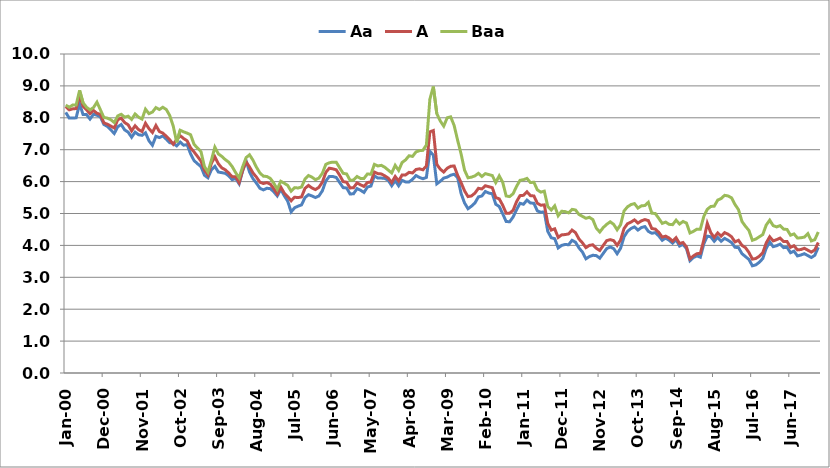
| Category | Aa | A | Baa |
|---|---|---|---|
| 2000-01-01 | 8.17 | 8.35 | 8.4 |
| 2000-02-01 | 7.99 | 8.25 | 8.33 |
| 2000-03-01 | 7.99 | 8.28 | 8.4 |
| 2000-04-01 | 8 | 8.29 | 8.4 |
| 2000-05-01 | 8.44 | 8.7 | 8.86 |
| 2000-06-01 | 8.1 | 8.36 | 8.47 |
| 2000-07-01 | 8.1 | 8.25 | 8.33 |
| 2000-08-01 | 7.96 | 8.13 | 8.25 |
| 2000-09-01 | 8.11 | 8.23 | 8.32 |
| 2000-10-01 | 8.08 | 8.14 | 8.49 |
| 2000-11-01 | 8.03 | 8.11 | 8.25 |
| 2000-12-01 | 7.79 | 7.84 | 8.01 |
| 2001-01-01 | 7.73 | 7.8 | 7.99 |
| 2001-02-01 | 7.62 | 7.74 | 7.94 |
| 2001-03-01 | 7.51 | 7.68 | 7.85 |
| 2001-04-01 | 7.72 | 7.94 | 8.06 |
| 2001-05-01 | 7.79 | 7.99 | 8.11 |
| 2001-06-01 | 7.62 | 7.85 | 8.02 |
| 2001-07-01 | 7.55 | 7.78 | 8.05 |
| 2001-08-01 | 7.39 | 7.59 | 7.95 |
| 2001-09-01 | 7.55 | 7.75 | 8.12 |
| 2001-10-01 | 7.47 | 7.63 | 8.02 |
| 2001-11-01 | 7.45 | 7.57 | 7.96 |
| 2001-12-01 | 7.53 | 7.83 | 8.27 |
| 2002-01-01 | 7.28 | 7.66 | 8.13 |
| 2002-02-01 | 7.14 | 7.54 | 8.18 |
| 2002-03-01 | 7.42 | 7.76 | 8.32 |
| 2002-04-01 | 7.38 | 7.57 | 8.26 |
| 2002-05-01 | 7.43 | 7.52 | 8.33 |
| 2002-06-01 | 7.33 | 7.42 | 8.26 |
| 2002-07-01 | 7.22 | 7.31 | 8.07 |
| 2002-08-01 | 7.2 | 7.17 | 7.74 |
| 2002-09-01 | 7.12 | 7.32 | 7.23 |
| 2002-10-01 | 7.24 | 7.44 | 7.61 |
| 2002-11-01 | 7.14 | 7.35 | 7.56 |
| 2002-12-01 | 7.16 | 7.28 | 7.52 |
| 2003-01-01 | 6.87 | 7.06 | 7.47 |
| 2003-02-01 | 6.66 | 6.93 | 7.17 |
| 2003-03-01 | 6.56 | 6.79 | 7.05 |
| 2003-04-01 | 6.47 | 6.64 | 6.94 |
| 2003-05-01 | 6.2 | 6.36 | 6.47 |
| 2003-06-01 | 6.12 | 6.21 | 6.3 |
| 2003-07-01 | 6.37 | 6.57 | 6.67 |
| 2003-08-01 | 6.48 | 6.78 | 7.08 |
| 2003-09-01 | 6.3 | 6.56 | 6.87 |
| 2003-10-01 | 6.28 | 6.43 | 6.79 |
| 2003-11-01 | 6.26 | 6.37 | 6.69 |
| 2003-12-01 | 6.18 | 6.27 | 6.61 |
| 2004-01-01 | 6.06 | 6.15 | 6.47 |
| 2004-02-01 | 6.1 | 6.15 | 6.28 |
| 2004-03-01 | 5.93 | 5.97 | 6.12 |
| 2004-04-01 | 6.33 | 6.35 | 6.46 |
| 2004-05-01 | 6.66 | 6.62 | 6.75 |
| 2004-06-01 | 6.3 | 6.46 | 6.84 |
| 2004-07-01 | 6.09 | 6.27 | 6.67 |
| 2004-08-01 | 5.95 | 6.14 | 6.45 |
| 2004-09-01 | 5.79 | 5.98 | 6.27 |
| 2004-10-01 | 5.74 | 5.94 | 6.17 |
| 2004-11-01 | 5.79 | 5.97 | 6.16 |
| 2004-12-01 | 5.78 | 5.92 | 6.1 |
| 2005-01-01 | 5.68 | 5.78 | 5.95 |
| 2005-02-01 | 5.55 | 5.61 | 5.76 |
| 2005-03-01 | 5.76 | 5.83 | 6.01 |
| 2005-04-01 | 5.56 | 5.64 | 5.95 |
| 2005-05-01 | 5.39 | 5.53 | 5.88 |
| 2005-06-01 | 5.05 | 5.4 | 5.7 |
| 2005-07-01 | 5.18 | 5.51 | 5.81 |
| 2005-08-01 | 5.23 | 5.5 | 5.8 |
| 2005-09-01 | 5.27 | 5.52 | 5.83 |
| 2005-10-01 | 5.5 | 5.79 | 6.08 |
| 2005-11-01 | 5.59 | 5.88 | 6.19 |
| 2005-12-01 | 5.55 | 5.8 | 6.14 |
| 2006-01-01 | 5.5 | 5.75 | 6.06 |
| 2006-02-01 | 5.55 | 5.82 | 6.11 |
| 2006-03-01 | 5.71 | 5.98 | 6.26 |
| 2006-04-01 | 6.02 | 6.29 | 6.54 |
| 2006-05-01 | 6.16 | 6.42 | 6.59 |
| 2006-06-01 | 6.16 | 6.4 | 6.61 |
| 2006-07-01 | 6.13 | 6.37 | 6.61 |
| 2006-08-01 | 5.97 | 6.2 | 6.43 |
| 2006-09-01 | 5.81 | 6 | 6.26 |
| 2006-10-01 | 5.8 | 5.98 | 6.24 |
| 2006-11-01 | 5.61 | 5.8 | 6.04 |
| 2006-12-01 | 5.62 | 5.81 | 6.05 |
| 2007-01-01 | 5.78 | 5.96 | 6.16 |
| 2007-02-01 | 5.73 | 5.9 | 6.1 |
| 2007-03-01 | 5.66 | 5.85 | 6.1 |
| 2007-04-01 | 5.83 | 5.97 | 6.24 |
| 2007-05-01 | 5.86 | 5.99 | 6.23 |
| 2007-06-01 | 6.18 | 6.3 | 6.54 |
| 2007-07-01 | 6.11 | 6.25 | 6.49 |
| 2007-08-01 | 6.11 | 6.24 | 6.51 |
| 2007-09-01 | 6.1 | 6.18 | 6.45 |
| 2007-10-01 | 6.04 | 6.11 | 6.36 |
| 2007-11-01 | 5.87 | 5.97 | 6.27 |
| 2007-12-01 | 6.03 | 6.16 | 6.51 |
| 2008-01-01 | 5.87 | 6.02 | 6.35 |
| 2008-02-01 | 6.04 | 6.21 | 6.6 |
| 2008-03-01 | 5.99 | 6.21 | 6.68 |
| 2008-04-01 | 5.99 | 6.29 | 6.81 |
| 2008-05-01 | 6.07 | 6.27 | 6.79 |
| 2008-06-01 | 6.19 | 6.38 | 6.93 |
| 2008-07-01 | 6.13 | 6.4 | 6.97 |
| 2008-08-01 | 6.09 | 6.37 | 6.98 |
| 2008-09-01 | 6.13 | 6.49 | 7.15 |
| 2008-10-01 | 6.95 | 7.56 | 8.58 |
| 2008-11-01 | 6.83 | 7.6 | 8.98 |
| 2008-12-01 | 5.93 | 6.54 | 8.13 |
| 2009-01-01 | 6.01 | 6.39 | 7.9 |
| 2009-02-01 | 6.11 | 6.3 | 7.74 |
| 2009-03-01 | 6.14 | 6.42 | 8 |
| 2009-04-01 | 6.2 | 6.48 | 8.03 |
| 2009-05-01 | 6.23 | 6.49 | 7.76 |
| 2009-06-01 | 6.13 | 6.2 | 7.3 |
| 2009-07-01 | 5.63 | 5.97 | 6.87 |
| 2009-08-01 | 5.33 | 5.71 | 6.36 |
| 2009-09-01 | 5.15 | 5.53 | 6.12 |
| 2009-10-01 | 5.23 | 5.55 | 6.14 |
| 2009-11-01 | 5.33 | 5.64 | 6.18 |
| 2009-12-01 | 5.52 | 5.79 | 6.26 |
| 2010-01-01 | 5.55 | 5.77 | 6.16 |
| 2010-02-01 | 5.69 | 5.87 | 6.25 |
| 2010-03-01 | 5.64 | 5.84 | 6.22 |
| 2010-04-01 | 5.62 | 5.81 | 6.19 |
| 2010-05-01 | 5.29 | 5.5 | 5.97 |
| 2010-06-01 | 5.22 | 5.46 | 6.18 |
| 2010-07-01 | 4.99 | 5.26 | 5.98 |
| 2010-08-01 | 4.75 | 5.01 | 5.55 |
| 2010-09-01 | 4.74 | 5.01 | 5.53 |
| 2010-10-01 | 4.89 | 5.1 | 5.62 |
| 2010-11-01 | 5.12 | 5.37 | 5.85 |
| 2010-12-01 | 5.32 | 5.56 | 6.04 |
| 2011-01-01 | 5.29 | 5.57 | 6.06 |
| 2011-02-01 | 5.42 | 5.68 | 6.1 |
| 2011-03-01 | 5.33 | 5.56 | 5.97 |
| 2011-04-01 | 5.32 | 5.55 | 5.98 |
| 2011-05-01 | 5.08 | 5.32 | 5.74 |
| 2011-06-01 | 5.04 | 5.26 | 5.67 |
| 2011-07-01 | 5.05 | 5.27 | 5.7 |
| 2011-08-01 | 4.44 | 4.69 | 5.22 |
| 2011-09-01 | 4.24 | 4.48 | 5.11 |
| 2011-10-01 | 4.21 | 4.52 | 5.24 |
| 2011-11-01 | 3.92 | 4.25 | 4.93 |
| 2011-12-01 | 4 | 4.33 | 5.07 |
| 2012-01-01 | 4.03 | 4.34 | 5.06 |
| 2012-02-01 | 4.02 | 4.36 | 5.02 |
| 2012-03-01 | 4.16 | 4.48 | 5.13 |
| 2012-04-01 | 4.1 | 4.4 | 5.11 |
| 2012-05-01 | 3.92 | 4.2 | 4.97 |
| 2012-06-01 | 3.79 | 4.08 | 4.91 |
| 2012-07-01 | 3.58 | 3.93 | 4.85 |
| 2012-08-01 | 3.65 | 4 | 4.88 |
| 2012-09-01 | 3.69 | 4.02 | 4.81 |
| 2012-10-01 | 3.68 | 3.91 | 4.54 |
| 2012-11-01 | 3.6 | 3.84 | 4.42 |
| 2012-12-01 | 3.75 | 4 | 4.56 |
| 2013-01-01 | 3.9 | 4.15 | 4.66 |
| 2013-02-01 | 3.95 | 4.18 | 4.74 |
| 2013-03-01 | 3.9 | 4.15 | 4.66 |
| 2013-04-01 | 3.74 | 4 | 4.49 |
| 2013-05-01 | 3.91 | 4.17 | 4.65 |
| 2013-06-01 | 4.27 | 4.53 | 5.08 |
| 2013-07-01 | 4.44 | 4.68 | 5.21 |
| 2013-08-01 | 4.53 | 4.73 | 5.28 |
| 2013-09-01 | 4.58 | 4.8 | 5.31 |
| 2013-10-01 | 4.48 | 4.7 | 5.17 |
| 2013-11-01 | 4.56 | 4.77 | 5.24 |
| 2013-12-01 | 4.59 | 4.81 | 5.25 |
| 2014-01-01 | 4.44 | 4.778 | 5.351 |
| 2014-02-01 | 4.38 | 4.53 | 5.01 |
| 2014-03-01 | 4.4 | 4.51 | 5 |
| 2014-04-01 | 4.3 | 4.41 | 4.85 |
| 2014-05-01 | 4.16 | 4.26 | 4.69 |
| 2014-06-01 | 4.23 | 4.29 | 4.73 |
| 2014-07-01 | 4.16 | 4.23 | 4.66 |
| 2014-08-01 | 4.07 | 4.13 | 4.65 |
| 2014-09-01 | 4.18 | 4.24 | 4.79 |
| 2014-10-01 | 3.98 | 4.06 | 4.67 |
| 2014-11-01 | 4.03 | 4.09 | 4.75 |
| 2014-12-01 | 3.9 | 3.95 | 4.7 |
| 2015-01-01 | 3.52 | 3.58 | 4.39 |
| 2015-02-01 | 3.62 | 3.67 | 4.44 |
| 2015-03-01 | 3.67 | 3.74 | 4.51 |
| 2015-04-01 | 3.63 | 3.75 | 4.51 |
| 2015-05-01 | 4.05 | 4.17 | 4.91 |
| 2015-06-01 | 4.29 | 4.69 | 5.13 |
| 2015-07-01 | 4.27 | 4.4 | 5.22 |
| 2015-08-01 | 4.13 | 4.25 | 5.23 |
| 2015-09-01 | 4.25 | 4.39 | 5.42 |
| 2015-10-01 | 4.13 | 4.29 | 5.47 |
| 2015-11-01 | 4.22 | 4.4 | 5.57 |
| 2015-12-01 | 4.16 | 4.35 | 5.55 |
| 2016-01-01 | 4.09 | 4.27 | 5.49 |
| 2016-02-01 | 3.94 | 4.11 | 5.28 |
| 2016-03-01 | 3.93 | 4.16 | 5.12 |
| 2016-04-01 | 3.74 | 4 | 4.75 |
| 2016-05-01 | 3.65 | 3.93 | 4.6 |
| 2016-06-01 | 3.56 | 3.78 | 4.47 |
| 2016-07-01 | 3.36 | 3.57 | 4.16 |
| 2016-08-01 | 3.39 | 3.59 | 4.2 |
| 2016-09-01 | 3.47 | 3.66 | 4.27 |
| 2016-10-01 | 3.59 | 3.77 | 4.34 |
| 2016-11-01 | 3.91 | 4.08 | 4.64 |
| 2016-12-01 | 4.11 | 4.27 | 4.79 |
| 2017-01-01 | 3.96 | 4.14 | 4.62 |
| 2017-02-01 | 3.99 | 4.18 | 4.58 |
| 2017-03-01 | 4.04 | 4.23 | 4.62 |
| 2017-04-01 | 3.93 | 4.12 | 4.51 |
| 2017-05-01 | 3.94 | 4.12 | 4.5 |
| 2017-06-01 | 3.77 | 3.94 | 4.32 |
| 2017-07-01 | 3.82 | 3.99 | 4.36 |
| 2017-08-01 | 3.67 | 3.86 | 4.23 |
| 2017-09-01 | 3.7 | 3.87 | 4.24 |
| 2017-10-01 | 3.74 | 3.91 | 4.26 |
| 2017-11-01 | 3.68 | 3.85 | 4.37 |
| 2017-12-01 | 3.62 | 3.79 | 4.14 |
| 2018-01-01 | 3.69 | 3.86 | 4.18 |
| 2018-02-01 | 3.94 | 4.09 | 4.42 |